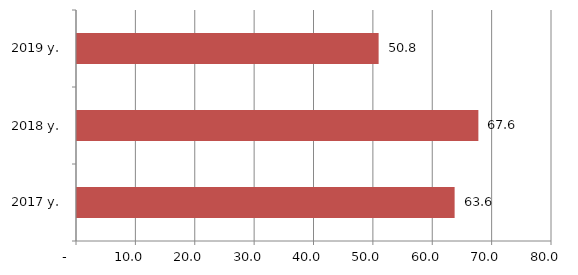
| Category | Series 0 |
|---|---|
| 2017 y. | 63.6 |
| 2018 y. | 67.6 |
| 2019 y. | 50.8 |